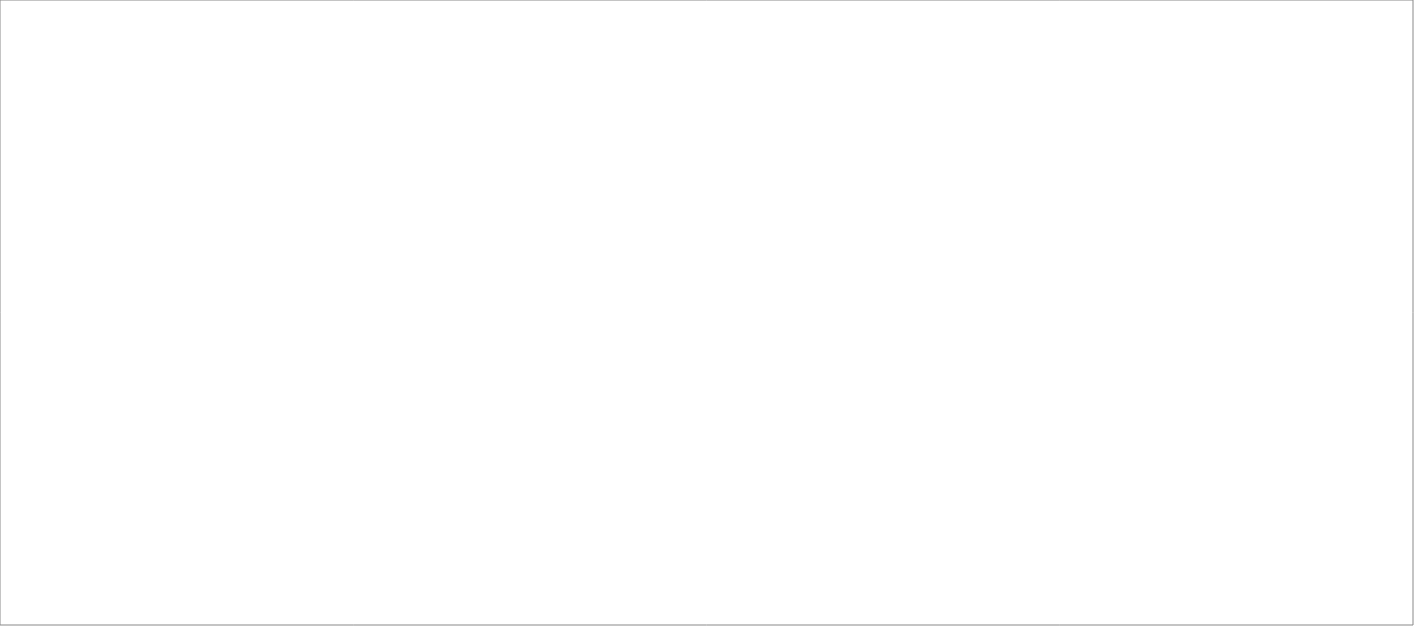
| Category | Total |
|---|---|
| Poolia Sverige AB | 85 |
| Clockwork Bemanning & Rekrytering AB | 85 |
| Randstad AB | 80 |
| Experis AB | 51.9 |
| Signpost AB | 45 |